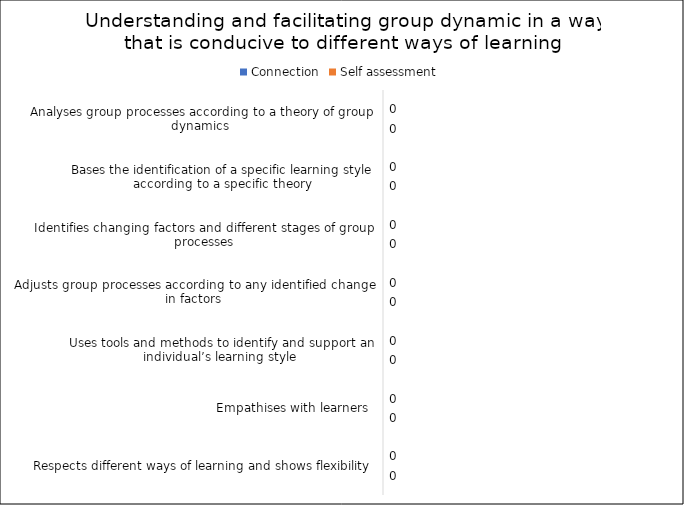
| Category | Connection | Self assessment |
|---|---|---|
| Analyses group processes according to a theory of group dynamics  | 0 | 0 |
| Bases the identification of a specific learning style according to a specific theory | 0 | 0 |
| Identifies changing factors and different stages of group processes | 0 | 0 |
| Adjusts group processes according to any identified change in factors | 0 | 0 |
| Uses tools and methods to identify and support an individual’s learning style  | 0 | 0 |
| Empathises with learners  | 0 | 0 |
| Respects different ways of learning and shows flexibility | 0 | 0 |